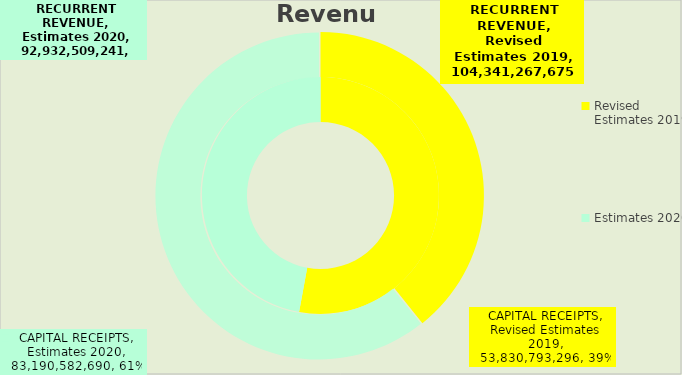
| Category | RECURRENT REVENUE | CAPITAL RECEIPTS |
|---|---|---|
| Revised Estimates 2019 | 104341267675 | 53830793296 |
| Estimates 2020 | 92932509241 | 83190582690.498 |